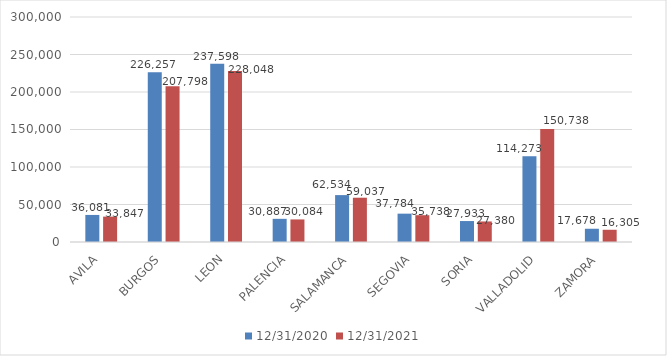
| Category | 31/12/2020 | 31/12/2021 |
|---|---|---|
| AVILA | 36081.265 | 33846.534 |
| BURGOS | 226256.597 | 207797.698 |
| LEON | 237597.549 | 228047.96 |
| PALENCIA | 30887.232 | 30084.048 |
| SALAMANCA | 62534.378 | 59036.695 |
| SEGOVIA | 37784.325 | 35738.195 |
| SORIA | 27933.091 | 27380.306 |
| VALLADOLID | 114273.442 | 150737.612 |
| ZAMORA | 17677.958 | 16305.446 |